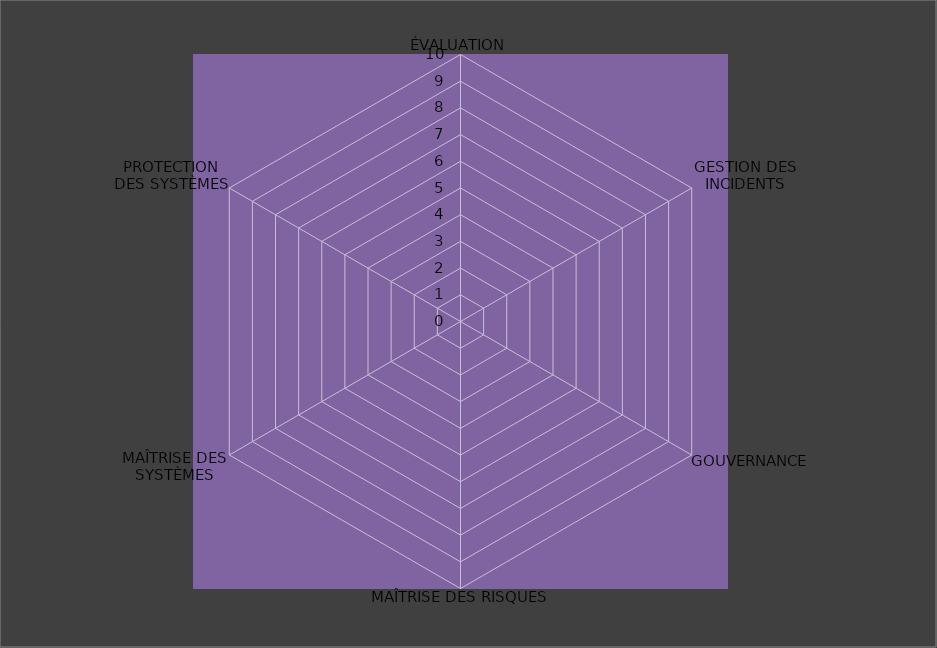
| Category | Année 2028 |
|---|---|
| ÉVALUATION | 0 |
| GESTION DES INCIDENTS | 0 |
| GOUVERNANCE | 0 |
| MAÎTRISE DES RISQUES | 0 |
| MAÎTRISE DES SYSTÈMES | 0 |
| PROTECTION
DES SYSTÈMES | 0 |